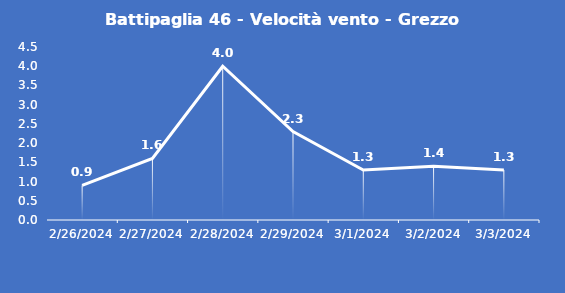
| Category | Battipaglia 46 - Velocità vento - Grezzo (m/s) |
|---|---|
| 2/26/24 | 0.9 |
| 2/27/24 | 1.6 |
| 2/28/24 | 4 |
| 2/29/24 | 2.3 |
| 3/1/24 | 1.3 |
| 3/2/24 | 1.4 |
| 3/3/24 | 1.3 |